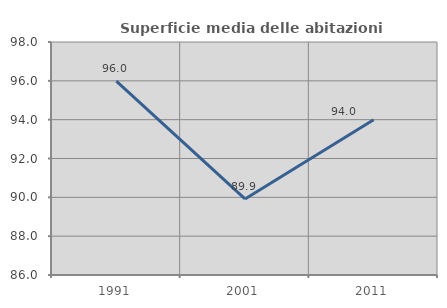
| Category | Superficie media delle abitazioni occupate |
|---|---|
| 1991.0 | 95.98 |
| 2001.0 | 89.918 |
| 2011.0 | 94 |